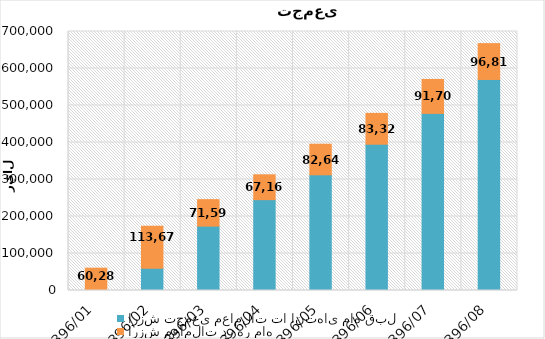
| Category | ارزش تجمعی معاملات تا انتهای ماه قبل | ارزش معاملات در هر ماه |
|---|---|---|
| 1396/01 | 0 | 60288 |
| 1396/02 | 60288 | 113671 |
| 1396/03 | 173959 | 71591 |
| 1396/04 | 245550 | 67162 |
| 1396/05 | 312712 | 82645 |
| 1396/06 | 395357 | 83323 |
| 1396/07 | 478680 | 91706 |
| 1396/08 | 570386 | 96819 |